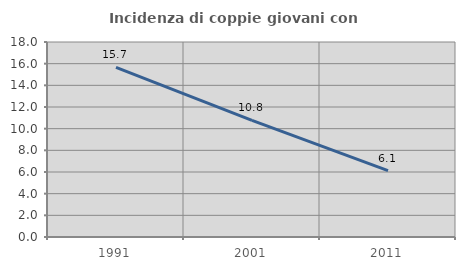
| Category | Incidenza di coppie giovani con figli |
|---|---|
| 1991.0 | 15.663 |
| 2001.0 | 10.762 |
| 2011.0 | 6.119 |